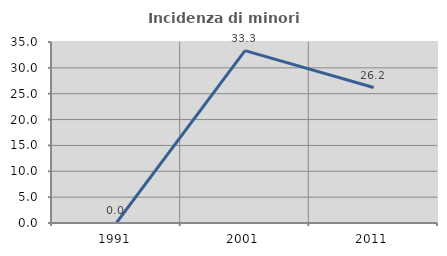
| Category | Incidenza di minori stranieri |
|---|---|
| 1991.0 | 0 |
| 2001.0 | 33.333 |
| 2011.0 | 26.19 |